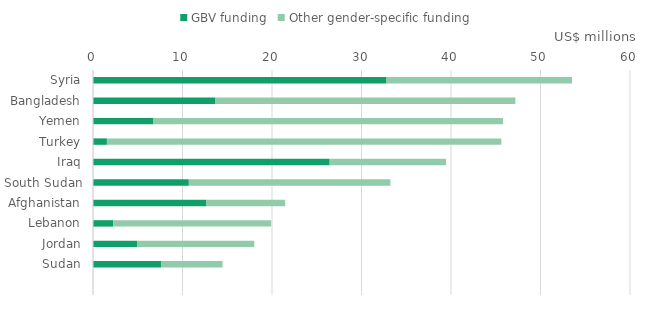
| Category | GBV funding | Other gender-specific funding |
|---|---|---|
| Syria | 32.799 | 20.717 |
| Bangladesh | 13.688 | 33.503 |
| Yemen | 6.763 | 39.045 |
| Turkey | 1.554 | 44.072 |
| Iraq | 26.441 | 13.01 |
| South Sudan | 10.707 | 22.524 |
| Afghanistan | 12.679 | 8.797 |
| Lebanon | 2.258 | 17.649 |
| Jordan | 4.917 | 13.103 |
| Sudan | 7.618 | 6.86 |